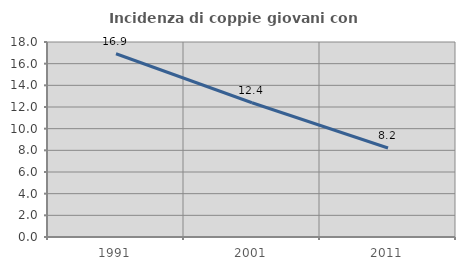
| Category | Incidenza di coppie giovani con figli |
|---|---|
| 1991.0 | 16.913 |
| 2001.0 | 12.392 |
| 2011.0 | 8.212 |